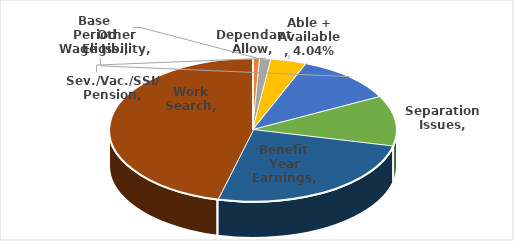
| Category | Series 0 |
|---|---|
| Dependant Allow | 0 |
| Base Period Wage Iss. | 0.007 |
| Sev./Vac./SSI/ Pension | 0.013 |
| Able + Available | 0.04 |
| Other Eligibility | 0.113 |
| Separation Issues | 0.114 |
| Benefit Year Earnings | 0.252 |
| Work Search | 0.46 |